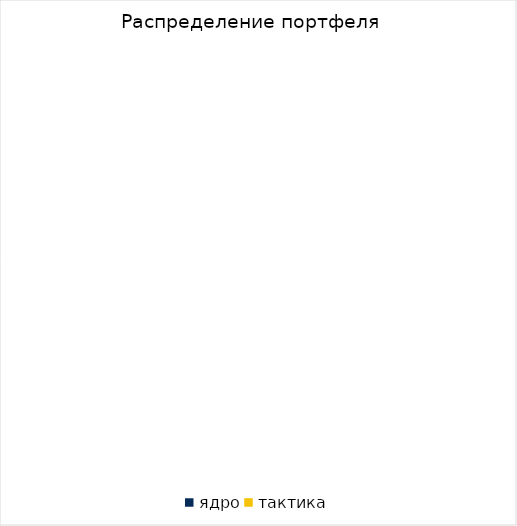
| Category | Series 0 |
|---|---|
| ядро | 0 |
| тактика | 0 |